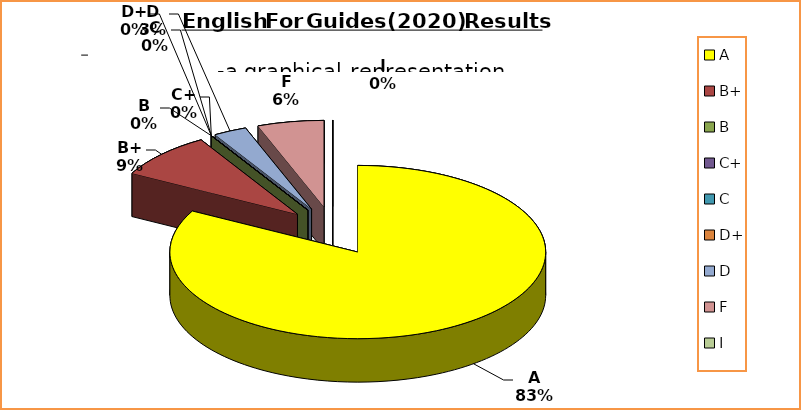
| Category | Series 0 |
|---|---|
| A | 29 |
| B+ | 3 |
| B | 0 |
| C+ | 0 |
| C | 0 |
| D+ | 0 |
| D | 1 |
| F | 2 |
| I | 0 |